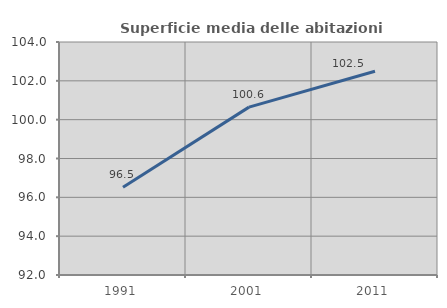
| Category | Superficie media delle abitazioni occupate |
|---|---|
| 1991.0 | 96.523 |
| 2001.0 | 100.646 |
| 2011.0 | 102.492 |